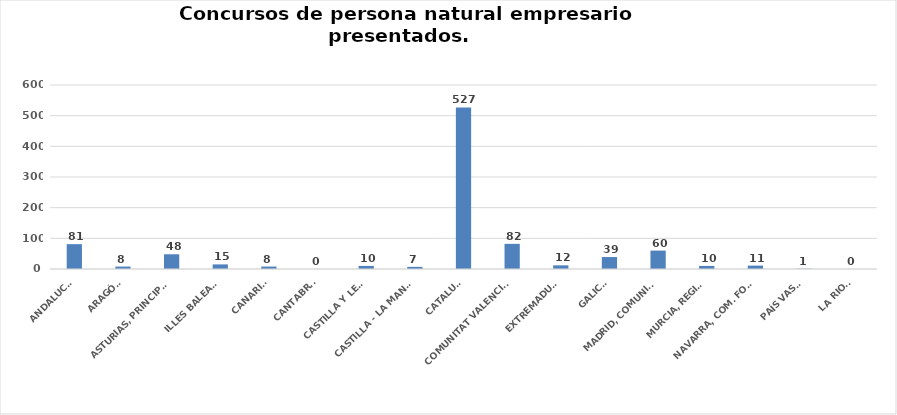
| Category | Series 0 |
|---|---|
| ANDALUCÍA | 81 |
| ARAGÓN | 8 |
| ASTURIAS, PRINCIPADO | 48 |
| ILLES BALEARS | 15 |
| CANARIAS | 8 |
| CANTABRIA | 0 |
| CASTILLA Y LEÓN | 10 |
| CASTILLA - LA MANCHA | 7 |
| CATALUÑA | 527 |
| COMUNITAT VALENCIANA | 82 |
| EXTREMADURA | 12 |
| GALICIA | 39 |
| MADRID, COMUNIDAD | 60 |
| MURCIA, REGIÓN | 10 |
| NAVARRA, COM. FORAL | 11 |
| PAÍS VASCO | 1 |
| LA RIOJA | 0 |